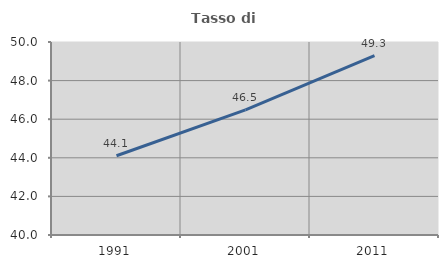
| Category | Tasso di occupazione   |
|---|---|
| 1991.0 | 44.107 |
| 2001.0 | 46.483 |
| 2011.0 | 49.297 |